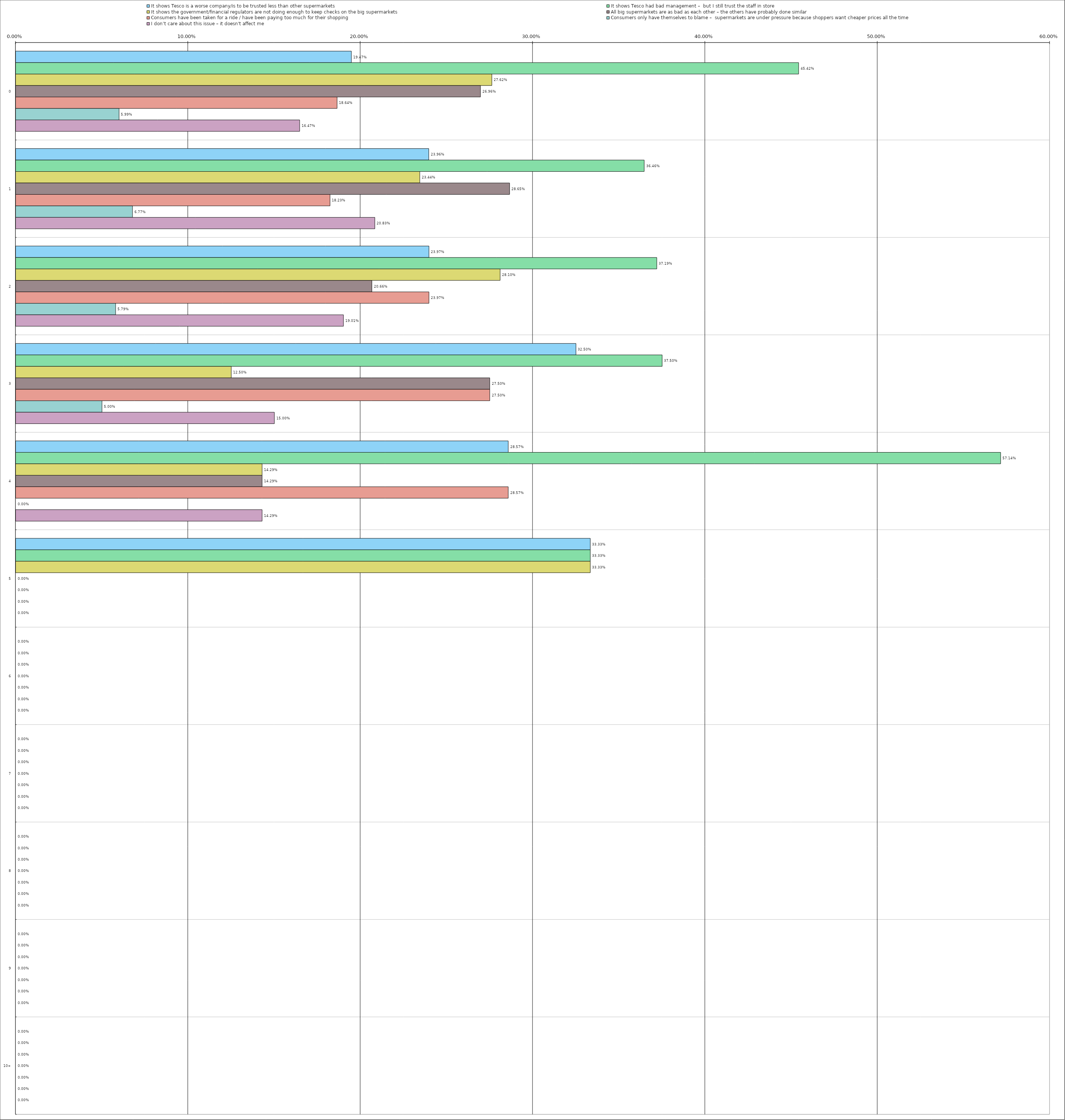
| Category | It shows Tesco is a worse company/is to be trusted less than other supermarkets | It shows Tesco had bad management –  but I still trust the staff in store | It shows the government/financial regulators are not doing enough to keep checks on the big supermarkets | All big supermarkets are as bad as each other – the others have probably done similar | Consumers have been taken for a ride / have been paying too much for their shopping | Consumers only have themselves to blame –  supermarkets are under pressure because shoppers want cheaper prices all the time | I don’t care about this issue – it doesn't affect me |
|---|---|---|---|---|---|---|---|
| 0 | 0.195 | 0.454 | 0.276 | 0.27 | 0.186 | 0.06 | 0.165 |
| 1 | 0.24 | 0.365 | 0.234 | 0.286 | 0.182 | 0.068 | 0.208 |
| 2 | 0.24 | 0.372 | 0.281 | 0.207 | 0.24 | 0.058 | 0.19 |
| 3 | 0.325 | 0.375 | 0.125 | 0.275 | 0.275 | 0.05 | 0.15 |
| 4 | 0.286 | 0.571 | 0.143 | 0.143 | 0.286 | 0 | 0.143 |
| 5 | 0.333 | 0.333 | 0.333 | 0 | 0 | 0 | 0 |
| 6 | 0 | 0 | 0 | 0 | 0 | 0 | 0 |
| 7 | 0 | 0 | 0 | 0 | 0 | 0 | 0 |
| 8 | 0 | 0 | 0 | 0 | 0 | 0 | 0 |
| 9 | 0 | 0 | 0 | 0 | 0 | 0 | 0 |
| 10 | 0 | 0 | 0 | 0 | 0 | 0 | 0 |